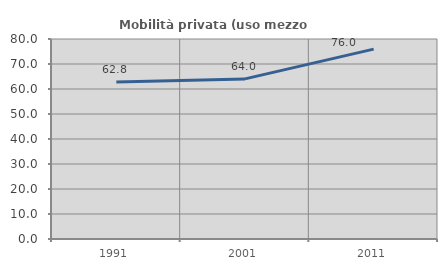
| Category | Mobilità privata (uso mezzo privato) |
|---|---|
| 1991.0 | 62.844 |
| 2001.0 | 64.035 |
| 2011.0 | 75.964 |